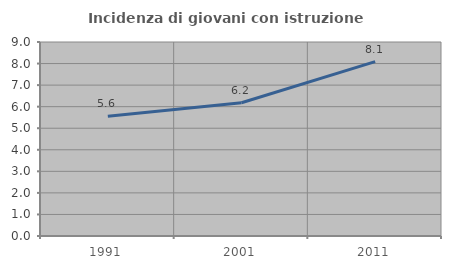
| Category | Incidenza di giovani con istruzione universitaria |
|---|---|
| 1991.0 | 5.556 |
| 2001.0 | 6.18 |
| 2011.0 | 8.092 |